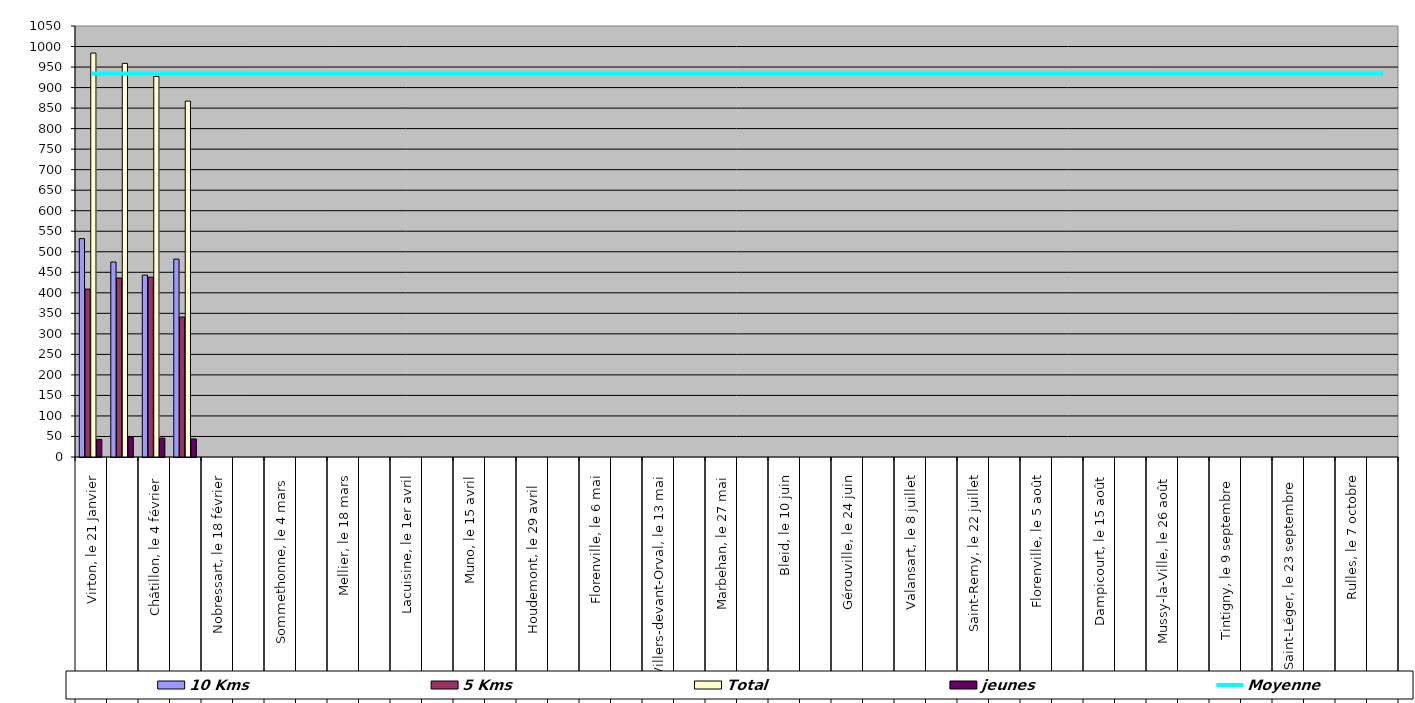
| Category | 10 Kms | 5 Kms | Total | jeunes |
|---|---|---|---|---|
| 0 | 532 | 409 | 984 | 43 |
| 1 | 475 | 436 | 959 | 48 |
| 2 | 443 | 438 | 927 | 46 |
| 3 | 482 | 341 | 867 | 44 |
| 4 | 0 | 0 | 0 | 0 |
| 5 | 0 | 0 | 0 | 0 |
| 6 | 0 | 0 | 0 | 0 |
| 7 | 0 | 0 | 0 | 0 |
| 8 | 0 | 0 | 0 | 0 |
| 9 | 0 | 0 | 0 | 0 |
| 10 | 0 | 0 | 0 | 0 |
| 11 | 0 | 0 | 0 | 0 |
| 12 | 0 | 0 | 0 | 0 |
| 13 | 0 | 0 | 0 | 0 |
| 14 | 0 | 0 | 0 | 0 |
| 15 | 0 | 0 | 0 | 0 |
| 16 | 0 | 0 | 0 | 0 |
| 17 | 0 | 0 | 0 | 0 |
| 18 | 0 | 0 | 0 | 0 |
| 19 | 0 | 0 | 0 | 0 |
| 20 | 0 | 0 | 0 | 0 |
| 21 | 0 | 0 | 0 | 0 |
| 22 | 0 | 0 | 0 | 0 |
| 23 | 0 | 0 | 0 | 0 |
| 24 | 0 | 0 | 0 | 0 |
| 25 | 0 | 0 | 0 | 0 |
| 26 | 0 | 0 | 0 | 0 |
| 27 | 0 | 0 | 0 | 0 |
| 28 | 0 | 0 | 0 | 0 |
| 29 | 0 | 0 | 0 | 0 |
| 30 | 0 | 0 | 0 | 0 |
| 31 | 0 | 0 | 0 | 0 |
| 32 | 0 | 0 | 0 | 0 |
| 33 | 0 | 0 | 0 | 0 |
| 34 | 0 | 0 | 0 | 0 |
| 35 | 0 | 0 | 0 | 0 |
| 36 | 0 | 0 | 0 | 0 |
| 37 | 0 | 0 | 0 | 0 |
| 38 | 0 | 0 | 0 | 0 |
| 39 | 0 | 0 | 0 | 0 |
| 40 | 0 | 0 | 0 | 0 |
| 41 | 0 | 0 | 0 | 0 |